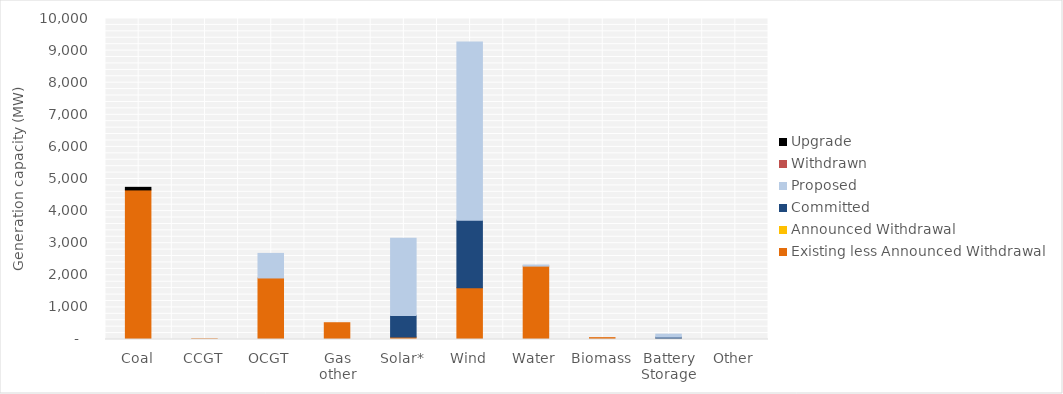
| Category | Existing less Announced Withdrawal | Announced Withdrawal | Committed | Proposed | Withdrawn | Upgrade |
|---|---|---|---|---|---|---|
| Coal | 4660 | 0 | 0 | 0 | 0 | 80 |
| CCGT | 21 | 0 | 0 | 0 | 0 | 0 |
| OCGT | 1916.8 | 0 | 0 | 765 | 0 | 0 |
| Gas other | 522.612 | 0 | 0 | 0 | 0 | 0 |
| Solar* | 76.312 | 0 | 674.02 | 2400.7 | 0 | 0 |
| Wind | 1612.9 | 0 | 2105.25 | 5549.5 | 0 | 0 |
| Water | 2286.237 | 0 | 0 | 34 | 0 | 0 |
| Biomass | 57.604 | 0 | 0 | 0 | 0 | 0 |
| Battery Storage | 25 | 0 | 50 | 92 | 0 | 0 |
| Other | 0 | 0 | 0 | 0 | 0 | 0 |